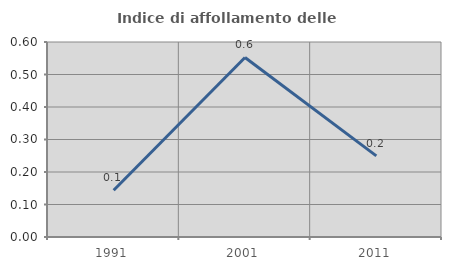
| Category | Indice di affollamento delle abitazioni  |
|---|---|
| 1991.0 | 0.144 |
| 2001.0 | 0.552 |
| 2011.0 | 0.25 |